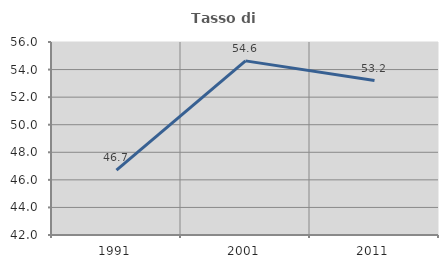
| Category | Tasso di occupazione   |
|---|---|
| 1991.0 | 46.713 |
| 2001.0 | 54.63 |
| 2011.0 | 53.202 |